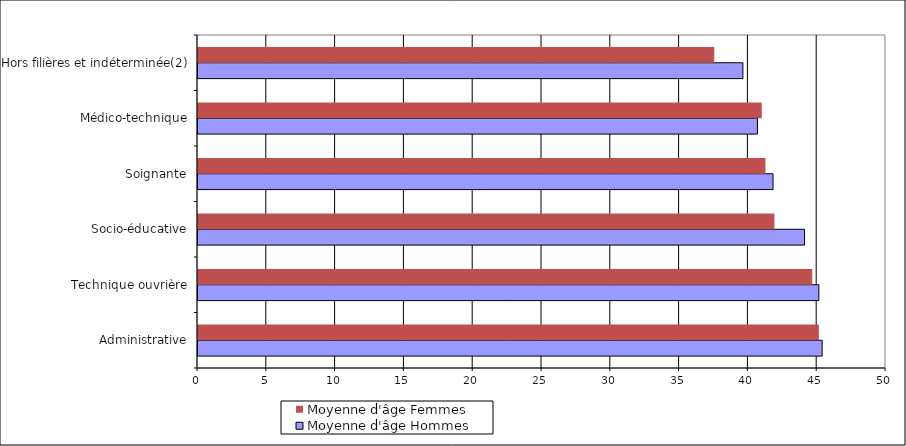
| Category | Moyenne d'âge |
|---|---|
| Administrative | 45.12 |
| Technique ouvrière | 44.64 |
| Socio-éducative | 41.89 |
| Soignante | 41.24 |
| Médico-technique | 40.97 |
| Hors filières et indéterminée(2) | 37.52 |